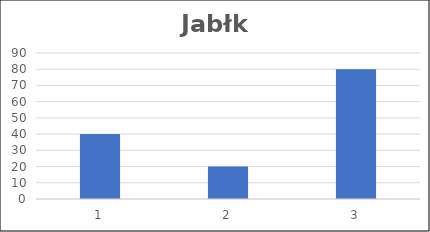
| Category | Jabłka |
|---|---|
| 0 | 40 |
| 1 | 20 |
| 2 | 80 |